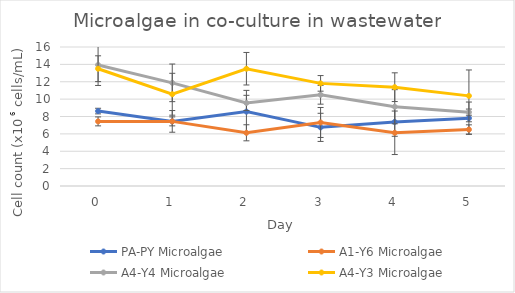
| Category | PA-PY Microalgae | A1-Y6 Microalgae | A4-Y4 Microalgae | A4-Y3 Microalgae |
|---|---|---|---|---|
| 0.0 | 8.625 | 7.438 | 13.938 | 13.5 |
| 1.0 | 7.438 | 7.438 | 11.875 | 10.562 |
| 2.0 | 8.562 | 6.125 | 9.562 | 13.5 |
| 3.0 | 6.75 | 7.312 | 10.5 | 11.812 |
| 4.0 | 7.375 | 6.125 | 9.125 | 11.375 |
| 5.0 | 7.812 | 6.5 | 8.5 | 10.375 |